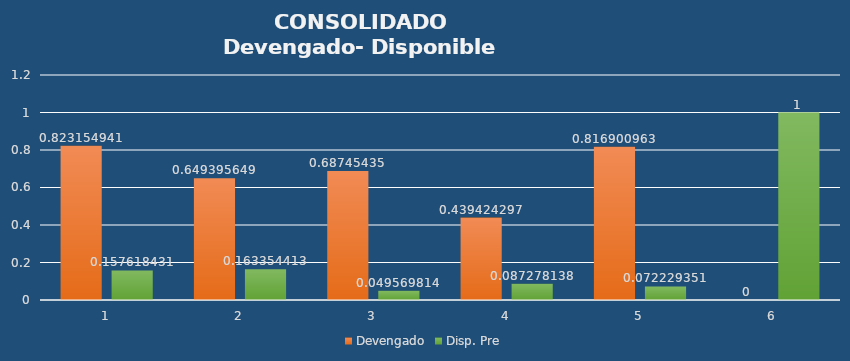
| Category | Devengado | Disp. Pre |
|---|---|---|
| 0 | 0.823 | 0.158 |
| 1 | 0.649 | 0.163 |
| 2 | 0.687 | 0.05 |
| 3 | 0.439 | 0.087 |
| 4 | 0.817 | 0.072 |
| 5 | 0 | 1 |